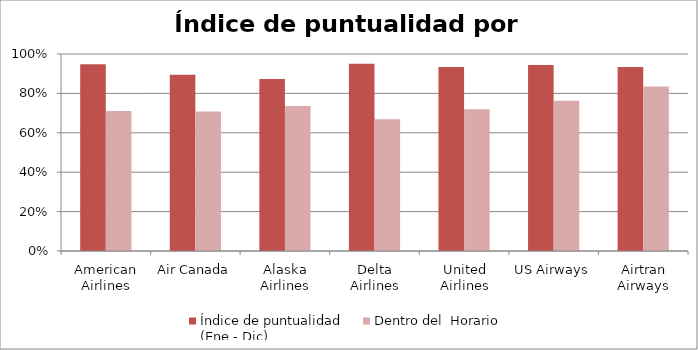
| Category | Índice de puntualidad
(Ene - Dic) | Dentro del  Horario |
|---|---|---|
| American Airlines | 0.948 | 0.71 |
| Air Canada | 0.895 | 0.708 |
| Alaska Airlines | 0.873 | 0.737 |
| Delta Airlines | 0.951 | 0.669 |
| United Airlines | 0.935 | 0.72 |
| US Airways | 0.944 | 0.762 |
| Airtran Airways | 0.935 | 0.835 |